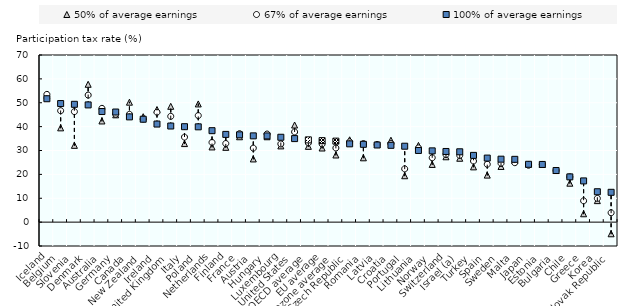
| Category | 50% of average earnings | 67% of average earnings | 100% of average earnings |
|---|---|---|---|
| Iceland | 53.133 | 53.501 | 51.681 |
| Belgium | 39.484 | 46.655 | 49.66 |
| Slovenia | 32.156 | 46.279 | 49.348 |
| Denmark | 57.731 | 53.212 | 49.096 |
| Australia | 42.374 | 47.655 | 46.328 |
| Germany | 44.945 | 45.212 | 46.115 |
| Canada | 50.237 | 45.16 | 44.083 |
| New Zealand | 44.157 | 43.216 | 43.099 |
| Ireland | 47.154 | 46.04 | 41.077 |
| United Kingdom | 48.506 | 44.318 | 40.253 |
| Italy | 32.897 | 35.606 | 39.968 |
| Poland | 49.509 | 44.64 | 39.915 |
| Netherlands | 31.497 | 33.39 | 38.3 |
| Finland | 31.328 | 32.921 | 36.743 |
| France | 35.758 | 37.069 | 36.56 |
| Austria | 26.465 | 31.005 | 36.127 |
| Hungary | 35.757 | 36.904 | 36.111 |
| Luxembourg | 31.929 | 32.754 | 35.548 |
| United States | 40.668 | 37.784 | 34.984 |
| OECD average | 31.736 | 33.211 | 34.463 |
| EU average | 31.046 | 32.729 | 34.129 |
| Eurozone average | 28.116 | 31.052 | 33.922 |
| Czech Republic | 34.476 | 33.62 | 32.788 |
| Romania | 26.943 | 32.892 | 32.586 |
| Latvia | 32.636 | 32.47 | 32.308 |
| Croatia | 34.301 | 32.902 | 32.167 |
| Portugal | 19.425 | 22.314 | 31.796 |
| Lithuania | 32.132 | 31.058 | 30.016 |
| Norway | 24.168 | 26.967 | 29.848 |
| Switzerland | 27.374 | 28.307 | 29.594 |
| Israel (a) | 26.754 | 27.954 | 29.459 |
| Turkey | 23.146 | 25.585 | 27.953 |
| Spain | 19.694 | 24.241 | 26.821 |
| Sweden | 23.312 | 24.646 | 26.362 |
| Malta | 25.81 | 24.894 | 26.298 |
| Japan | 24.267 | 23.821 | 24.225 |
| Estonia | 24.16 | 24.16 | 24.16 |
| Bulgaria | 21.61 | 21.61 | 21.61 |
| Chile | 16.297 | 18.95 | 18.95 |
| Greece | 3.5 | 8.931 | 17.264 |
| Korea | 9.002 | 9.938 | 12.726 |
| Slovak Republic | -4.878 | 3.934 | 12.488 |